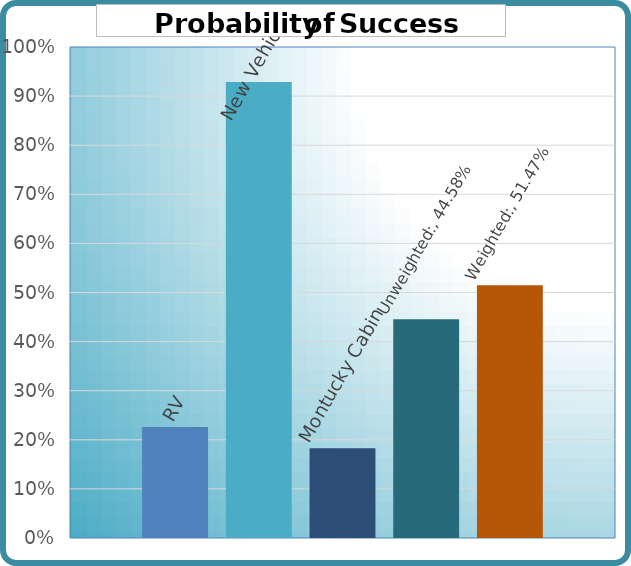
| Category | RV |   | New Vehicles | Montucky Cabin | Unweighted: | Weighted: |
|---|---|---|---|---|---|---|
| 0 | 0.226 |  | 0.929 | 0.183 | 0.446 | 0.515 |